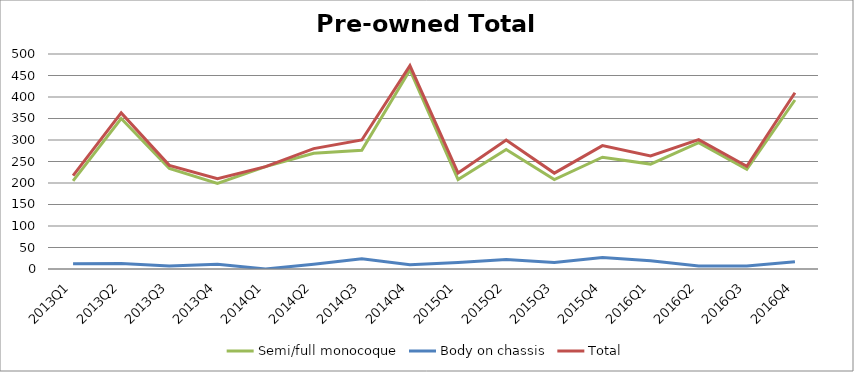
| Category | Semi/full monocoque | Body on chassis | Total |
|---|---|---|---|
| 2013Q1 | 205 | 12 | 217 |
| 2013Q2 | 350 | 13 | 363 |
| 2013Q3 | 234 | 7 | 241 |
| 2013Q4 | 199 | 11 | 210 |
| 2014Q1 | 238 | 0 | 238 |
| 2014Q2 | 269 | 11 | 280 |
| 2014Q3 | 276 | 24 | 300 |
| 2014Q4 | 463 | 10 | 473 |
| 2015Q1 | 208 | 15 | 223 |
| 2015Q2 | 278 | 22 | 300 |
| 2015Q3 | 208 | 15 | 223 |
| 2015Q4 | 260 | 27 | 287 |
| 2016Q1 | 244 | 19 | 263 |
| 2016Q2 | 294 | 7 | 301 |
| 2016Q3 | 232 | 7 | 239 |
| 2016Q4 | 393 | 17 | 410 |